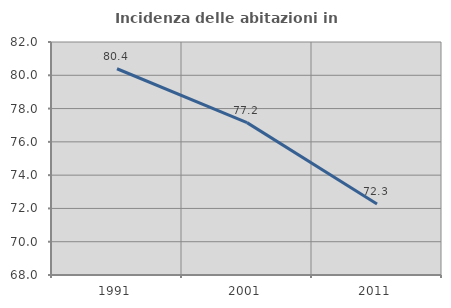
| Category | Incidenza delle abitazioni in proprietà  |
|---|---|
| 1991.0 | 80.392 |
| 2001.0 | 77.155 |
| 2011.0 | 72.263 |